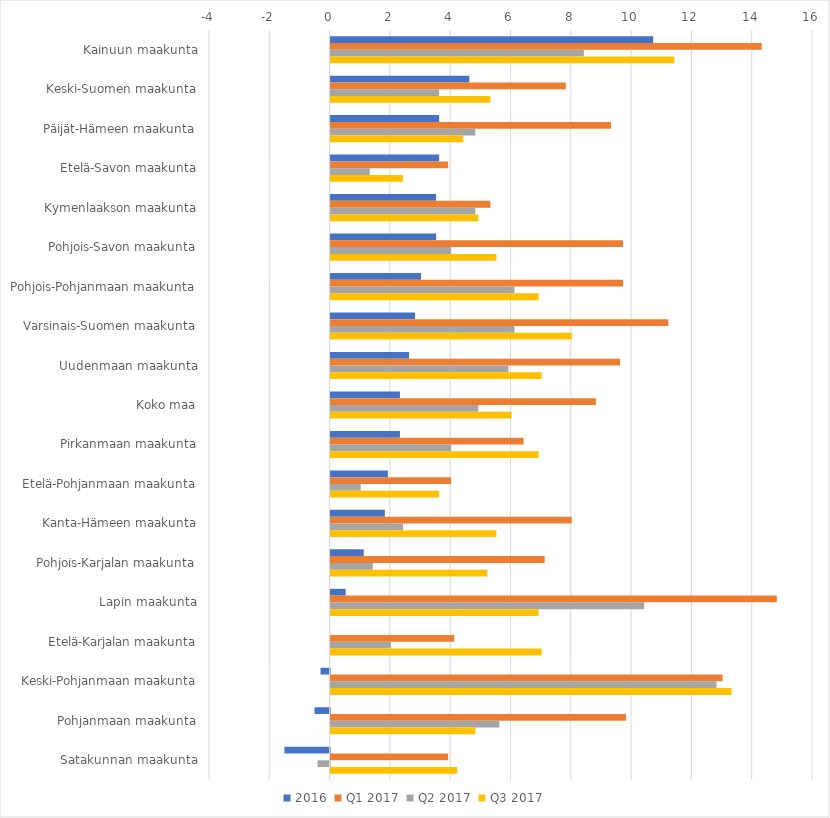
| Category | 2016 | Q1 2017 | Q2 2017 | Q3 2017 |
|---|---|---|---|---|
| Kainuun maakunta | 10.7 | 14.3 | 8.4 | 11.4 |
| Keski-Suomen maakunta | 4.6 | 7.8 | 3.6 | 5.3 |
| Päijät-Hämeen maakunta | 3.6 | 9.3 | 4.8 | 4.4 |
| Etelä-Savon maakunta | 3.6 | 3.9 | 1.3 | 2.4 |
| Kymenlaakson maakunta | 3.5 | 5.3 | 4.8 | 4.9 |
| Pohjois-Savon maakunta | 3.5 | 9.7 | 4 | 5.5 |
| Pohjois-Pohjanmaan maakunta | 3 | 9.7 | 6.1 | 6.9 |
| Varsinais-Suomen maakunta | 2.8 | 11.2 | 6.1 | 8 |
| Uudenmaan maakunta | 2.6 | 9.6 | 5.9 | 7 |
| Koko maa | 2.3 | 8.8 | 4.9 | 6 |
| Pirkanmaan maakunta | 2.3 | 6.4 | 4 | 6.9 |
| Etelä-Pohjanmaan maakunta | 1.9 | 4 | 1 | 3.6 |
| Kanta-Hämeen maakunta | 1.8 | 8 | 2.4 | 5.5 |
| Pohjois-Karjalan maakunta | 1.1 | 7.1 | 1.4 | 5.2 |
| Lapin maakunta | 0.5 | 14.8 | 10.4 | 6.9 |
| Etelä-Karjalan maakunta | 0 | 4.1 | 2 | 7 |
| Keski-Pohjanmaan maakunta | -0.3 | 13 | 12.8 | 13.3 |
| Pohjanmaan maakunta | -0.5 | 9.8 | 5.6 | 4.8 |
| Satakunnan maakunta | -1.5 | 3.9 | -0.4 | 4.2 |